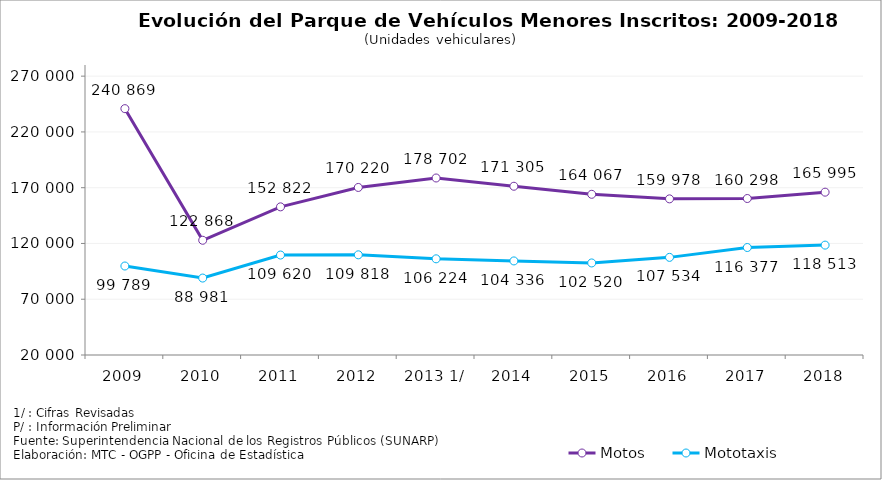
| Category | Motos | Mototaxis |
|---|---|---|
| 2009 | 240869 | 99789 |
| 2010 | 122868 | 88981 |
| 2011 | 152822 | 109620 |
| 2012 | 170220 | 109818 |
| 2013 1/ | 178702 | 106224 |
| 2014 | 171305 | 104336 |
| 2015 | 164067 | 102520 |
| 2016 | 159978 | 107534 |
| 2017 | 160298 | 116377 |
| 2018 | 165995 | 118513 |